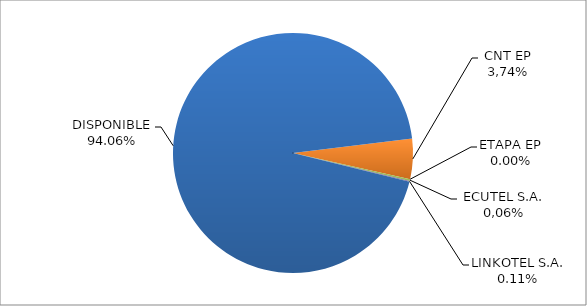
| Category | CODIGO DE AREA 6 |
|---|---|
| CORPORACIÓN NACIONAL TELECOMUNICACIONES CNT EP | 0.054 |
| ETAPA EP | 0 |
| CONECEL (ex ECUADORTELECOM S.A.) | 0.002 |
| LINKOTEL S.A. | 0.001 |
| DISPONIBLE | 0.941 |